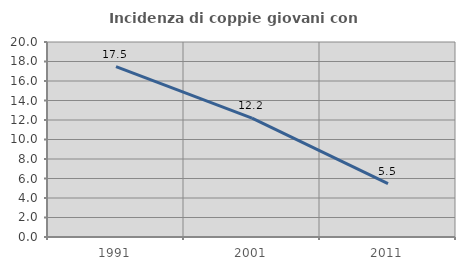
| Category | Incidenza di coppie giovani con figli |
|---|---|
| 1991.0 | 17.476 |
| 2001.0 | 12.195 |
| 2011.0 | 5.479 |